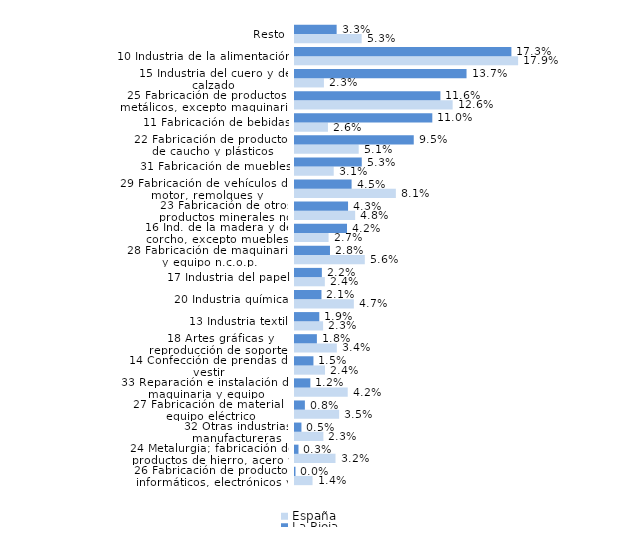
| Category | España | La Rioja |
|---|---|---|
| 26 Fabricación de productos informáticos, electrónicos y ópticos | 0.014 | 0 |
| 24 Metalurgia; fabricación de productos de hierro, acero y ferroaleaciones | 0.032 | 0.003 |
| 32 Otras industrias manufactureras | 0.023 | 0.005 |
| 27 Fabricación de material y equipo eléctrico | 0.035 | 0.008 |
| 33 Reparación e instalación de maquinaria y equipo | 0.042 | 0.012 |
| 14 Confección de prendas de vestir | 0.024 | 0.015 |
| 18 Artes gráficas y reproducción de soportes grabados | 0.034 | 0.018 |
| 13 Industria textil | 0.023 | 0.019 |
| 20 Industria química | 0.047 | 0.021 |
| 17 Industria del papel | 0.024 | 0.022 |
| 28 Fabricación de maquinaria y equipo n.c.o.p. | 0.056 | 0.028 |
| 16 Ind. de la madera y del corcho, excepto muebles; cestería y espartería | 0.027 | 0.042 |
| 23 Fabricación de otros productos minerales no metálicos | 0.048 | 0.043 |
| 29 Fabricación de vehículos de motor, remolques y semirremolques | 0.081 | 0.045 |
| 31 Fabricación de muebles | 0.031 | 0.053 |
| 22 Fabricación de productos de caucho y plásticos | 0.051 | 0.095 |
| 11 Fabricación de bebidas | 0.026 | 0.11 |
| 25 Fabricación de productos metálicos, excepto maquinaria y equipo | 0.126 | 0.116 |
| 15 Industria del cuero y del calzado | 0.023 | 0.137 |
| 10 Industria de la alimentación | 0.179 | 0.173 |
| Resto | 0.053 | 0.033 |